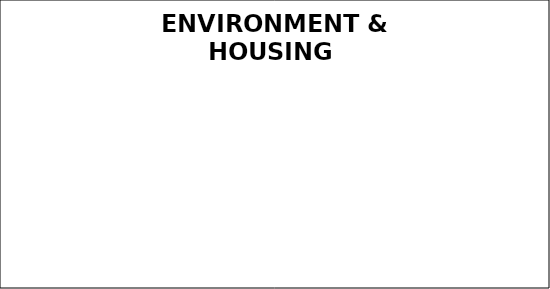
| Category | Green | Amber | Red |
|---|---|---|---|
| Q3 | 0 | 0 | 0 |